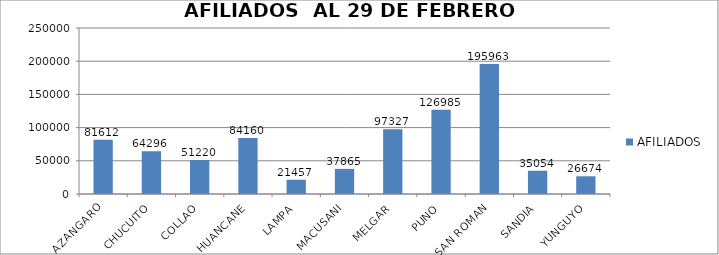
| Category | AFILIADOS |
|---|---|
| AZANGARO | 81612 |
| CHUCUITO | 64296 |
| COLLAO | 51220 |
| HUANCANE | 84160 |
| LAMPA | 21457 |
| MACUSANI | 37865 |
| MELGAR | 97327 |
| PUNO | 126985 |
| SAN ROMAN | 195963 |
| SANDIA | 35054 |
| YUNGUYO | 26674 |